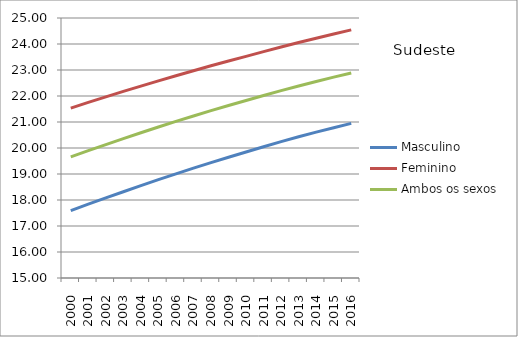
| Category | Masculino | Feminino | Ambos os sexos |
|---|---|---|---|
| 2000.0 | 17.593 | 21.536 | 19.657 |
| 2001.0 | 17.838 | 21.753 | 19.896 |
| 2002.0 | 18.08 | 21.966 | 20.131 |
| 2003.0 | 18.318 | 22.176 | 20.362 |
| 2004.0 | 18.552 | 22.381 | 20.587 |
| 2005.0 | 18.781 | 22.582 | 20.808 |
| 2006.0 | 19.006 | 22.779 | 21.023 |
| 2007.0 | 19.224 | 22.972 | 21.233 |
| 2008.0 | 19.438 | 23.161 | 21.437 |
| 2009.0 | 19.645 | 23.345 | 21.635 |
| 2010.0 | 19.847 | 23.525 | 21.827 |
| 2011.0 | 20.049 | 23.707 | 22.021 |
| 2012.0 | 20.244 | 23.884 | 22.207 |
| 2013.0 | 20.431 | 24.056 | 22.387 |
| 2014.0 | 20.61 | 24.224 | 22.561 |
| 2015.0 | 20.782 | 24.386 | 22.727 |
| 2016.0 | 20.946 | 24.542 | 22.887 |